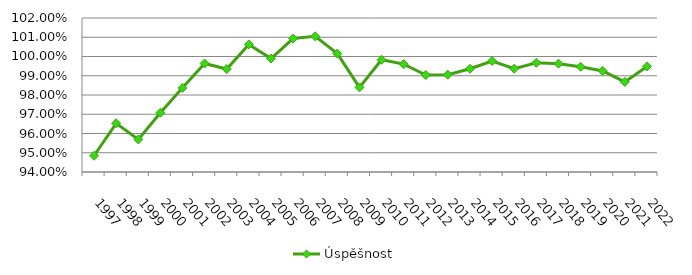
| Category | Úspěšnost |
|---|---|
| 1997.0 | 0.948 |
| 1998.0 | 0.965 |
| 1999.0 | 0.957 |
| 2000.0 | 0.971 |
| 2001.0 | 0.984 |
| 2002.0 | 0.996 |
| 2003.0 | 0.993 |
| 2004.0 | 1.006 |
| 2005.0 | 0.999 |
| 2006.0 | 1.009 |
| 2007.0 | 1.01 |
| 2008.0 | 1.002 |
| 2009.0 | 0.984 |
| 2010.0 | 0.998 |
| 2011.0 | 0.996 |
| 2012.0 | 0.99 |
| 2013.0 | 0.991 |
| 2014.0 | 0.994 |
| 2015.0 | 0.998 |
| 2016.0 | 0.994 |
| 2017.0 | 0.997 |
| 2018.0 | 0.996 |
| 2019.0 | 0.995 |
| 2020.0 | 0.992 |
| 2021.0 | 0.987 |
| 2022.0 | 0.995 |